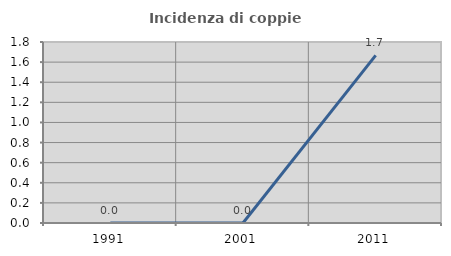
| Category | Incidenza di coppie miste |
|---|---|
| 1991.0 | 0 |
| 2001.0 | 0 |
| 2011.0 | 1.667 |